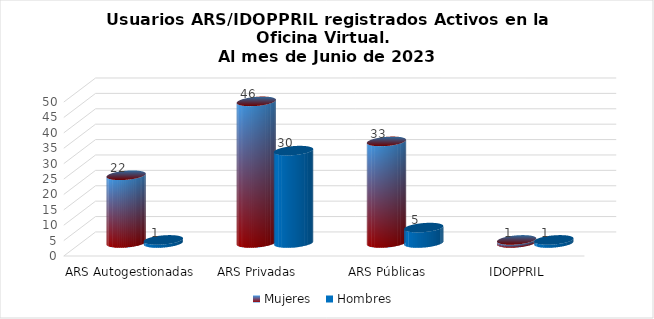
| Category | Mujeres | Hombres |
|---|---|---|
| ARS Autogestionadas | 22 | 1 |
| ARS Privadas | 46 | 30 |
| ARS Públicas | 33 | 5 |
| IDOPPRIL | 1 | 1 |